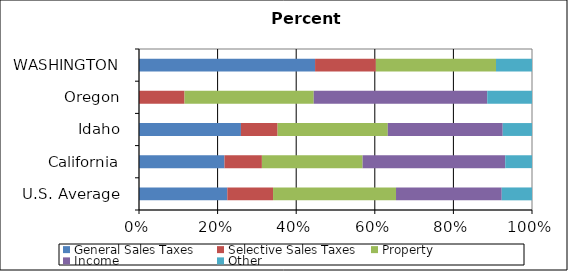
| Category | General Sales Taxes | Selective Sales Taxes | Property | Income | Other |
|---|---|---|---|---|---|
| U.S. Average | 0.225 | 0.116 | 0.313 | 0.269 | 0.077 |
| California | 0.217 | 0.095 | 0.256 | 0.363 | 0.068 |
| Idaho | 0.259 | 0.093 | 0.28 | 0.292 | 0.074 |
| Oregon | 0 | 0.116 | 0.329 | 0.442 | 0.114 |
| WASHINGTON | 0.448 | 0.155 | 0.306 | 0 | 0.092 |